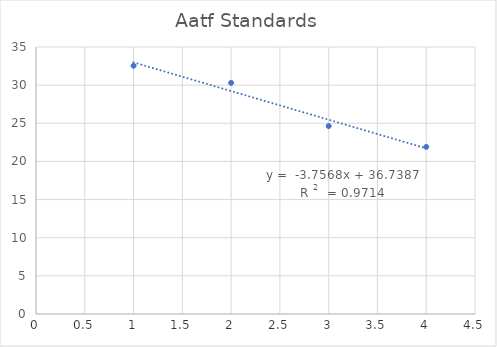
| Category | Series 0 |
|---|---|
| 4.0 | 21.907 |
| 3.0 | 24.637 |
| 2.0 | 30.301 |
| 1.0 | 32.542 |